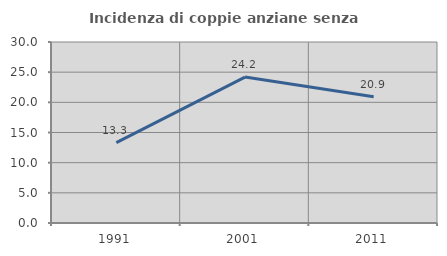
| Category | Incidenza di coppie anziane senza figli  |
|---|---|
| 1991.0 | 13.333 |
| 2001.0 | 24.183 |
| 2011.0 | 20.909 |